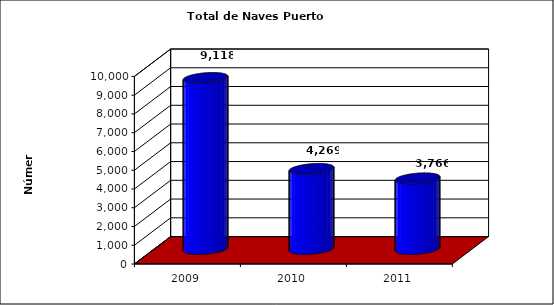
| Category | Series 0 |
|---|---|
| 2009.0 | 9118 |
| 2010.0 | 4269 |
| 2011.0 | 3766 |